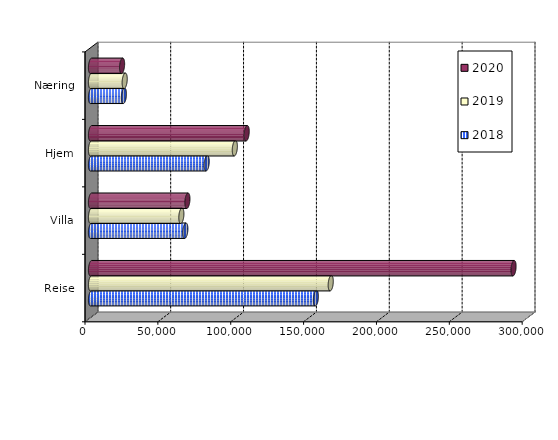
| Category | 2018 | 2019 | 2020 |
|---|---|---|---|
| Reise | 154340 | 164509.615 | 289967 |
| Villa | 64737.31 | 62005.237 | 66159.206 |
| Hjem | 79397.795 | 98699.425 | 106839.92 |
| Næring | 22608.497 | 23125.532 | 21334.431 |